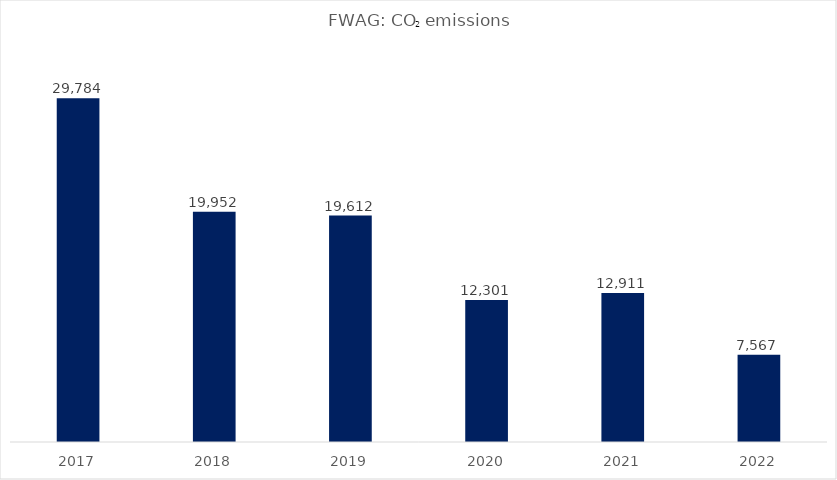
| Category | in tonnes |
|---|---|
| 2017.0 | 29784 |
| 2018.0 | 19952 |
| 2019.0 | 19612 |
| 2020.0 | 12301 |
| 2021.0 | 12911 |
| 2022.0 | 7567 |